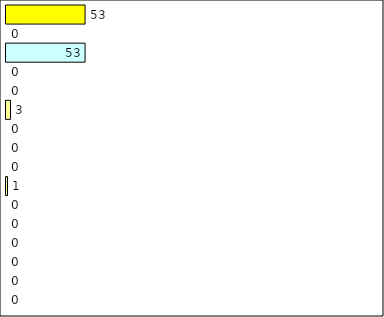
| Category | -2 | -1 | 0 | 1 | 2 | 3 | 4 | 5 | 6 | 7 | 8 | 9 | 10 | 11 | 12 | Perfect Round |
|---|---|---|---|---|---|---|---|---|---|---|---|---|---|---|---|---|
| 0 | 0 | 0 | 0 | 0 | 0 | 0 | 1 | 0 | 0 | 0 | 3 | 0 | 0 | 53 | 0 | 53 |